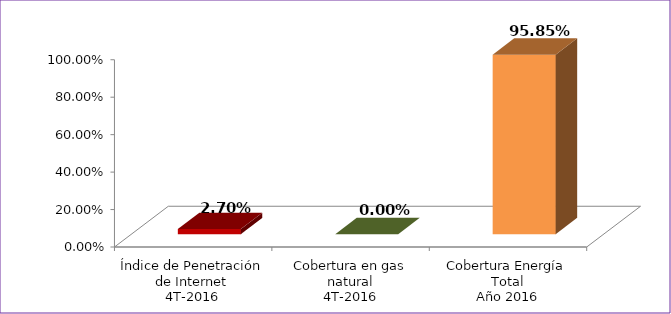
| Category | Series 0 |
|---|---|
| Índice de Penetración de Internet
4T-2016 | 0.027 |
| Cobertura en gas natural
4T-2016 | 0 |
| Cobertura Energía Total
Año 2016 | 0.958 |